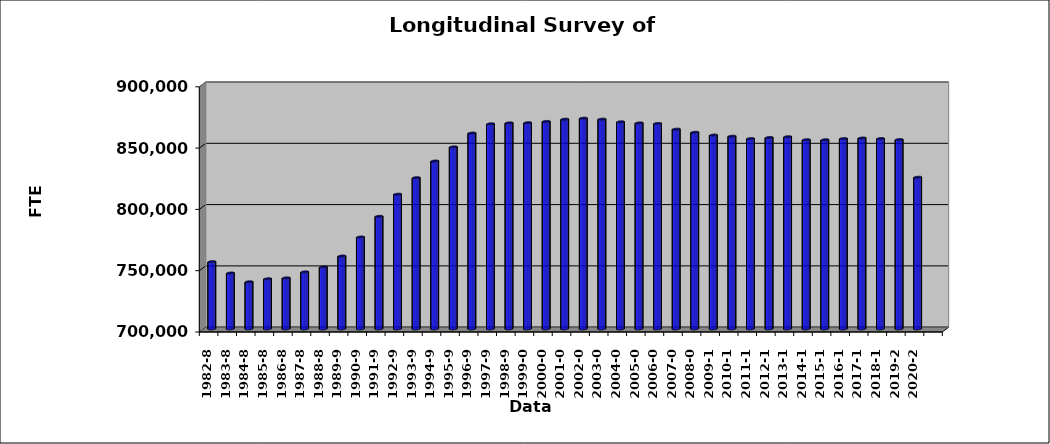
| Category | Series 0 |
|---|---|
| 1982-83 | 754938 |
| 1983-84 | 745702 |
| 1984-85 | 738525 |
| 1985-86 | 740976 |
| 1986-87 | 741733 |
| 1987-88 | 746615 |
| 1988-89 | 750642 |
| 1989-90 | 759531 |
| 1990-91 | 775056 |
| 1991-92 | 791938 |
| 1992-93 | 809982 |
| 1993-94 | 823435 |
| 1994-95 | 837028 |
| 1995-96 | 848559 |
| 1996-97 | 859830 |
| 1997-98 | 867380 |
| 1998-99 | 868161 |
| 1999-00 | 868279 |
| 2000-01 | 869357 |
| 2001-02 | 871154 |
| 2002-03 | 871981 |
| 2003-04 | 871202 |
| 2004-05 | 869005 |
| 2005-06 | 868092 |
| 2006-07 | 867698 |
| 2007-08 | 863047 |
| 2008-09 | 860477 |
| 2009-10 | 858205 |
| 2010-11 | 857273 |
| 2011-12 | 855327 |
| 2012-13 | 856203 |
| 2013-14 | 856846 |
| 2014-15 | 854419 |
| 2015-16 | 854403 |
| 2016-17 | 855329 |
| 2017-18 | 855804 |
| 2018-19 | 855360 |
| 2019-20 | 854521 |
| 2020-21 | 823827 |